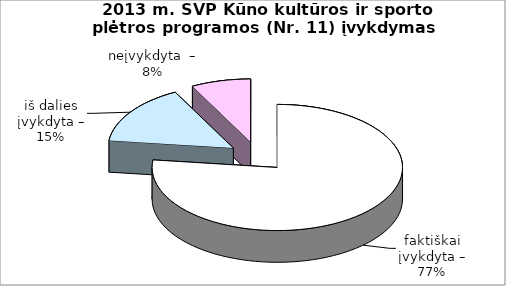
| Category | Series 0 |
|---|---|
| faktiškai įvykdyta – | 10 |
| iš dalies įvykdyta – | 2 |
| neįvykdyta  – | 1 |